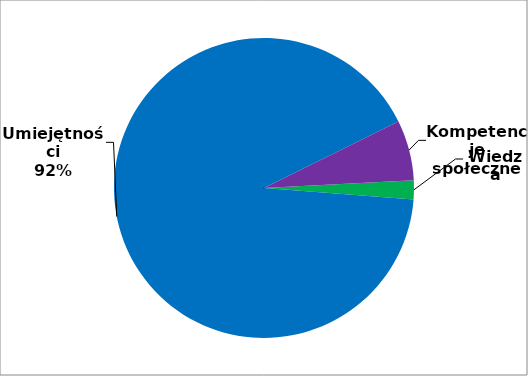
| Category | Series 0 |
|---|---|
| 0 | 12 |
| 1 | 537 |
| 2 | 38 |